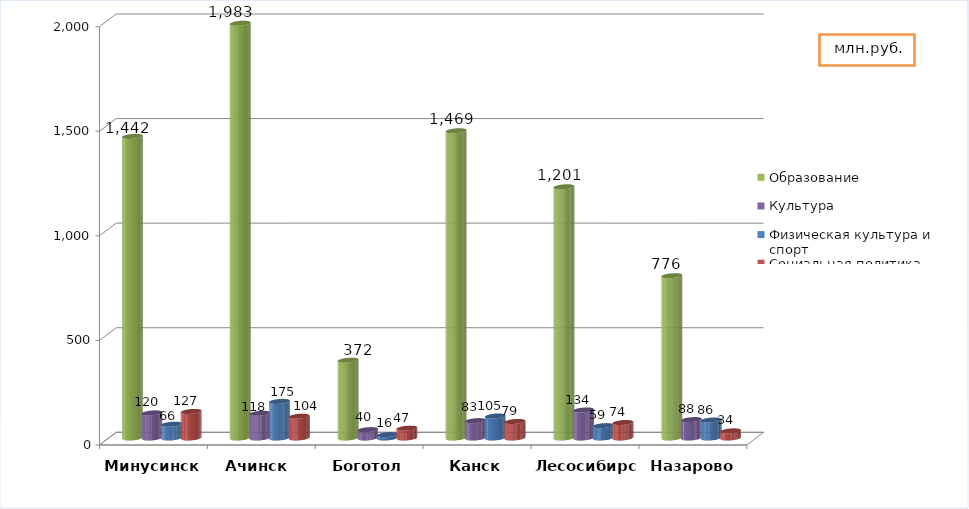
| Category | Образование | Культура | Физическая культура и спорт | Социальная политика |
|---|---|---|---|---|
| Минусинск | 1442 | 120 | 66 | 127 |
| Ачинск  | 1983 | 118 | 175 | 104 |
| Боготол | 372 | 40 | 16 | 47 |
| Канск | 1469 | 83 | 105 | 79 |
| Лесосибирск | 1201 | 134 | 59 | 74 |
| Назарово | 776 | 88 | 86 | 34 |